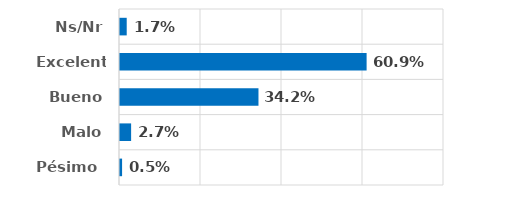
| Category | Series 0 |
|---|---|
| Pésimo  | 0.005 |
| Malo | 0.027 |
| Bueno | 0.342 |
| Excelente | 0.609 |
| Ns/Nr | 0.017 |